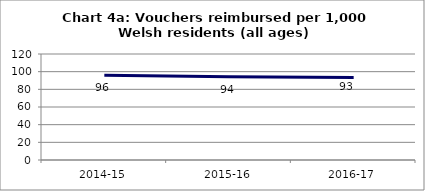
| Category | Chart 4a: Vouchers reimbursed per 1,000 Welsh residents (all ages) |
|---|---|
| 2014-15 | 95.92 |
| 2015-16 | 94.149 |
| 2016-17 | 93.419 |